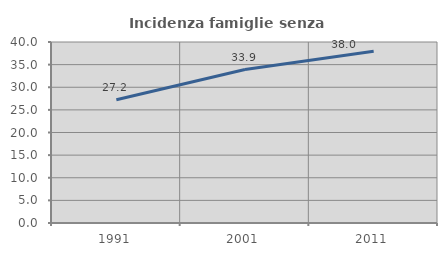
| Category | Incidenza famiglie senza nuclei |
|---|---|
| 1991.0 | 27.222 |
| 2001.0 | 33.912 |
| 2011.0 | 37.969 |